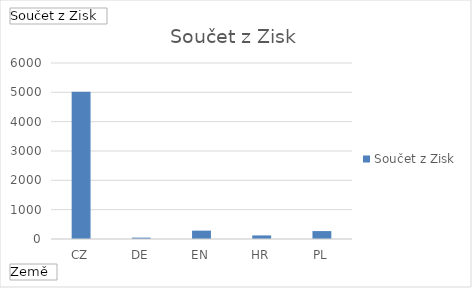
| Category | Celkem |
|---|---|
| CZ | 5017.3 |
| DE | 46.8 |
| EN | 285 |
| HR | 121.9 |
| PL | 270 |